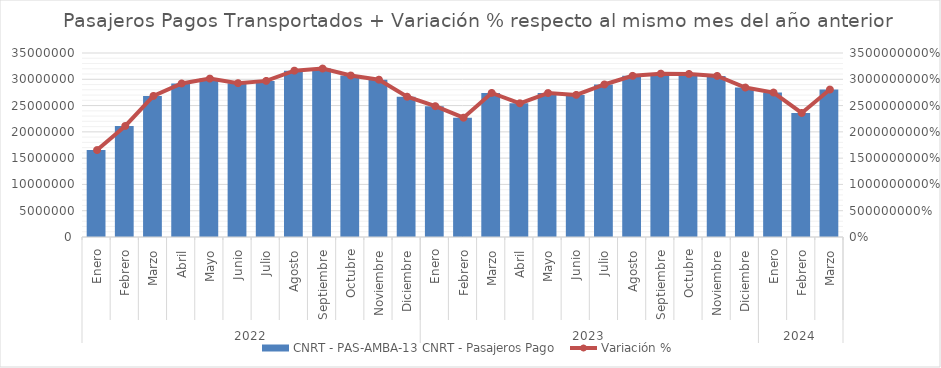
| Category | CNRT - PAS-AMBA-13 CNRT - Pasajeros Pago |
|---|---|
| 0 | 16540941 |
| 1 | 21122308 |
| 2 | 26835696 |
| 3 | 29204304 |
| 4 | 30132518 |
| 5 | 29264775 |
| 6 | 29695135 |
| 7 | 31638922 |
| 8 | 32041027 |
| 9 | 30717482 |
| 10 | 29922284 |
| 11 | 26683811 |
| 12 | 24885968 |
| 13 | 22695055 |
| 14 | 27405770.89 |
| 15 | 25432340.99 |
| 16 | 27379954 |
| 17 | 27034215 |
| 18 | 29014870 |
| 19 | 30654099 |
| 20 | 31072311 |
| 21 | 31018649 |
| 22 | 30637426 |
| 23 | 28431522 |
| 24 | 27475813 |
| 25 | 23593643 |
| 26 | 28048525 |